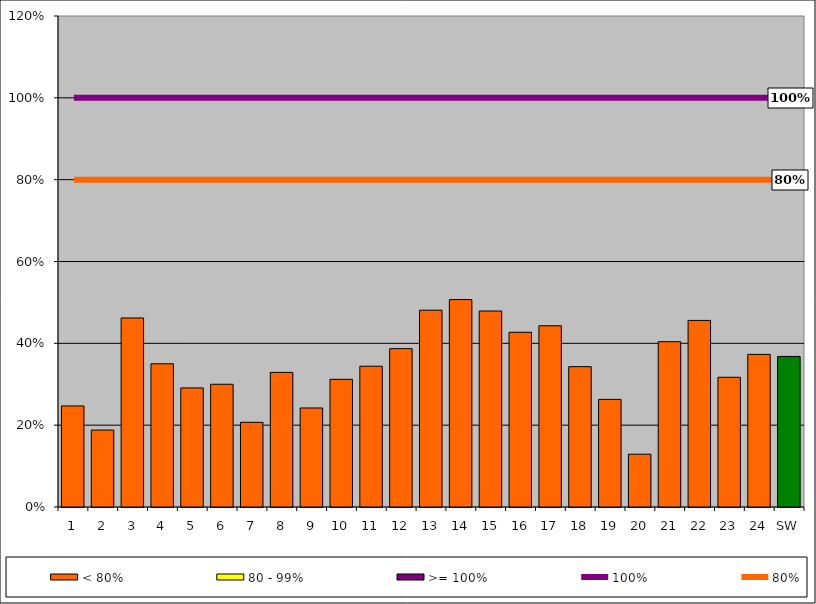
| Category | < 80% | 80 - 99% | >= 100% |
|---|---|---|---|
| 1 | 0.247 | 0 | 0 |
| 2 | 0.188 | 0 | 0 |
| 3 | 0.462 | 0 | 0 |
| 4 | 0.35 | 0 | 0 |
| 5 | 0.291 | 0 | 0 |
| 6 | 0.3 | 0 | 0 |
| 7 | 0.207 | 0 | 0 |
| 8 | 0.329 | 0 | 0 |
| 9 | 0.242 | 0 | 0 |
| 10 | 0.312 | 0 | 0 |
| 11 | 0.344 | 0 | 0 |
| 12 | 0.387 | 0 | 0 |
| 13 | 0.481 | 0 | 0 |
| 14 | 0.507 | 0 | 0 |
| 15 | 0.479 | 0 | 0 |
| 16 | 0.427 | 0 | 0 |
| 17 | 0.443 | 0 | 0 |
| 18 | 0.343 | 0 | 0 |
| 19 | 0.263 | 0 | 0 |
| 20 | 0.129 | 0 | 0 |
| 21 | 0.404 | 0 | 0 |
| 22 | 0.456 | 0 | 0 |
| 23 | 0.317 | 0 | 0 |
| 24 | 0.373 | 0 | 0 |
| SW | 0.368 | 0 | 0 |